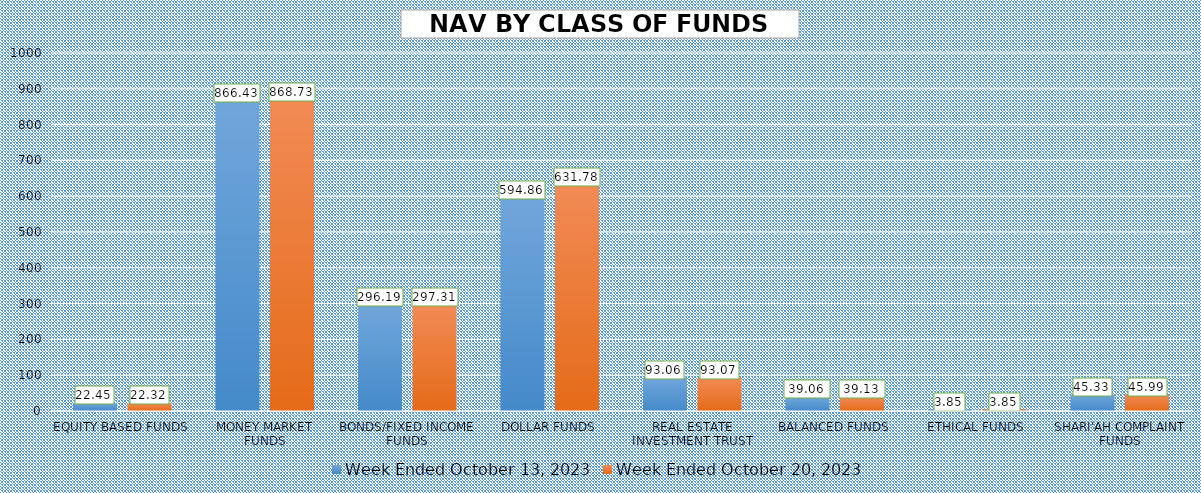
| Category | Week Ended October 13, 2023 | Week Ended October 20, 2023 |
|---|---|---|
| EQUITY BASED FUNDS | 22.453 | 22.321 |
| MONEY MARKET FUNDS | 866.43 | 868.733 |
| BONDS/FIXED INCOME FUNDS | 296.194 | 297.315 |
| DOLLAR FUNDS | 594.856 | 631.779 |
| REAL ESTATE INVESTMENT TRUST | 93.064 | 93.072 |
| BALANCED FUNDS | 39.056 | 39.126 |
| ETHICAL FUNDS | 3.848 | 3.852 |
| SHARI'AH COMPLAINT FUNDS | 45.329 | 45.994 |